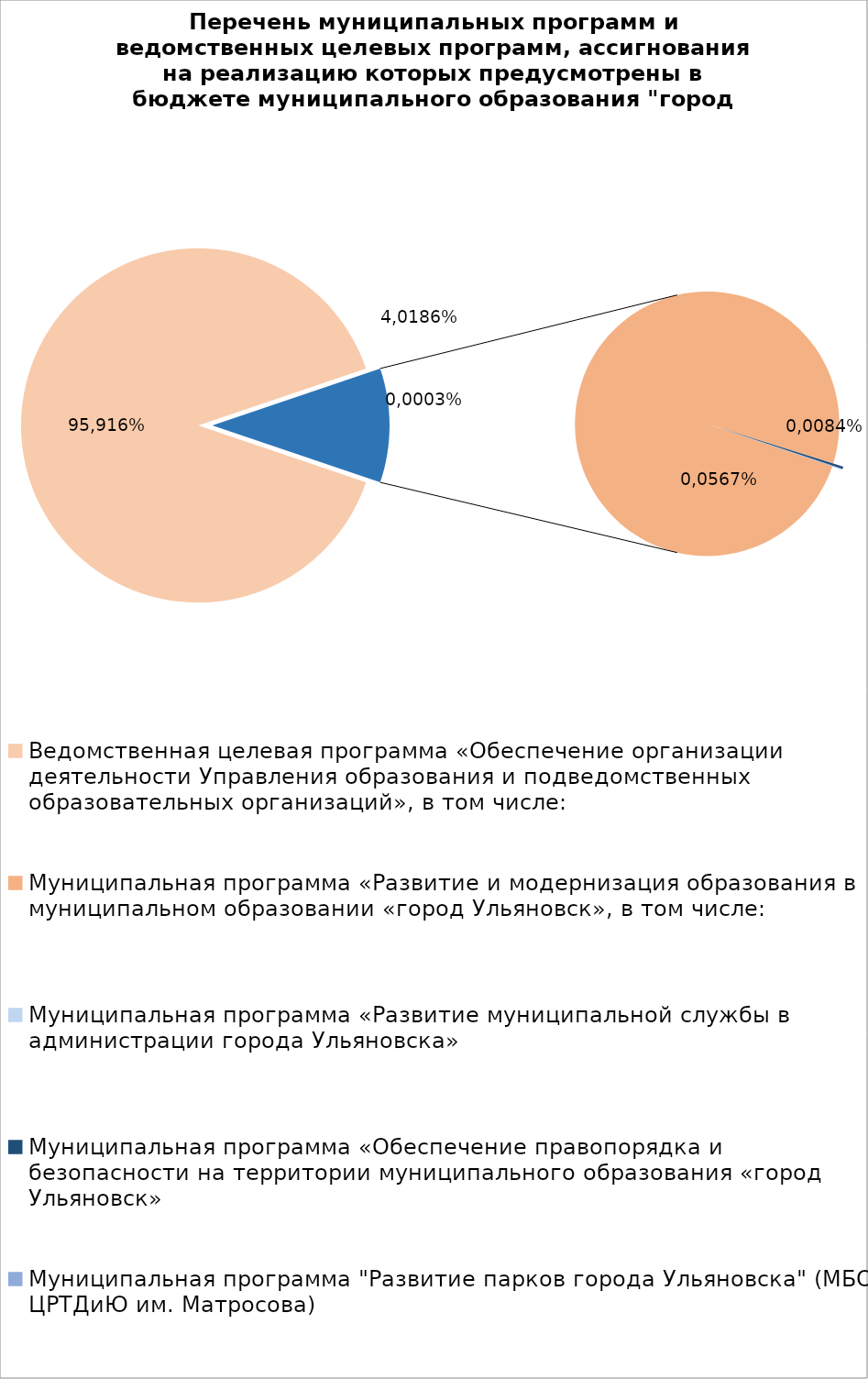
| Category | Series 0 |
|---|---|
| Ведомственная целевая программа «Обеспечение организации деятельности Управления образования и подведомственных образовательных организаций», в том числе: | 7865976.41 |
| Муниципальная программа «Развитие и модернизация образования в муниципальном образовании «город Ульяновск», в том числе: | 910463 |
| Муниципальная программа «Развитие муниципальной службы в администрации города Ульяновска» | 14.3 |
| Муниципальная программа «Обеспечение правопорядка и безопасности на территории муниципального образования «город Ульяновск» | 2700 |
| Муниципальная программа "Развитие парков города Ульяновска" (МБОУ ЦРТДиЮ им. Матросова) | 600 |